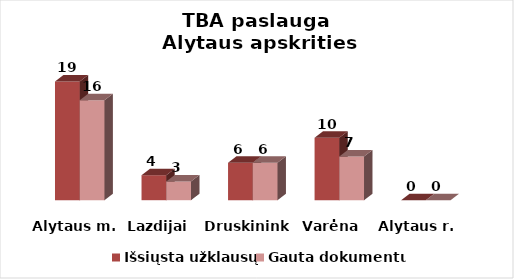
| Category | Išsiųsta užklausų | Gauta dokumentų |
|---|---|---|
| Alytaus m. | 19 | 16 |
| Lazdijai | 4 | 3 |
| Druskininkai | 6 | 6 |
| Varėna | 10 | 7 |
| Alytaus r. | 0 | 0 |